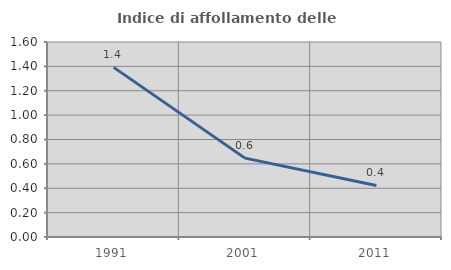
| Category | Indice di affollamento delle abitazioni  |
|---|---|
| 1991.0 | 1.392 |
| 2001.0 | 0.647 |
| 2011.0 | 0.423 |